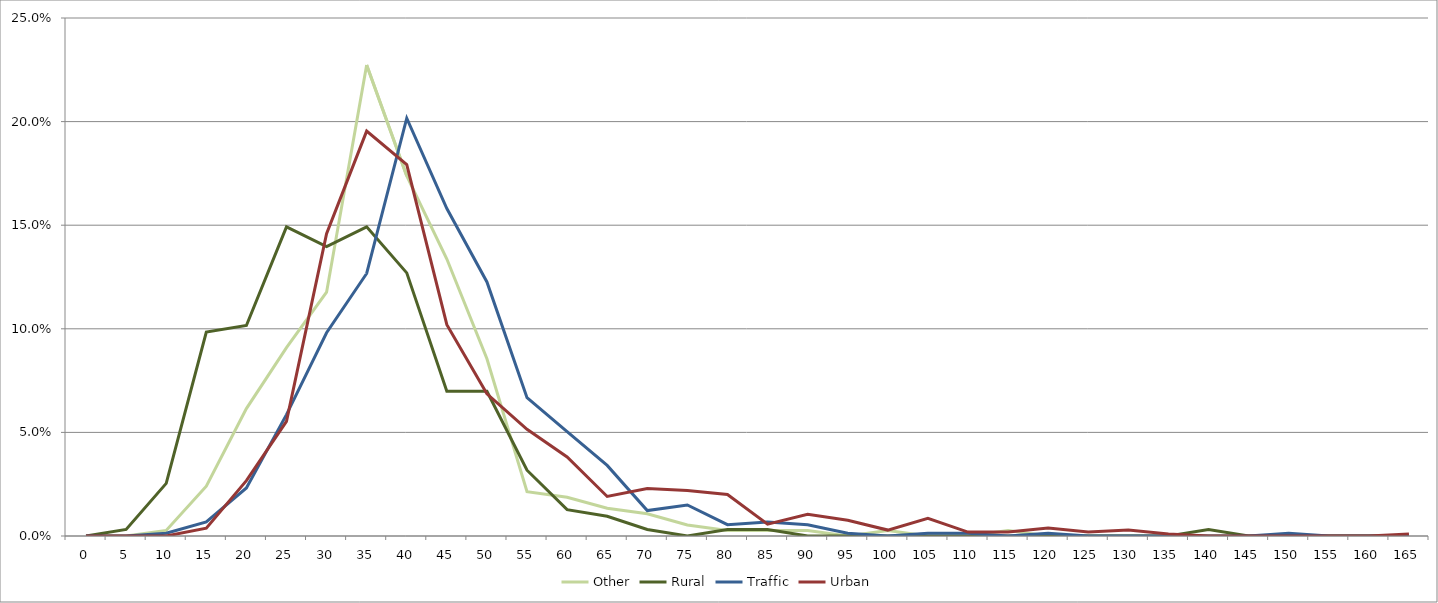
| Category | Other | Rural | Traffic | Urban |
|---|---|---|---|---|
| 0.0 | 0 | 0 | 0 | 0 |
| 5.0 | 0 | 0.003 | 0 | 0 |
| 10.0 | 0.003 | 0.025 | 0.001 | 0 |
| 15.0 | 0.024 | 0.098 | 0.007 | 0.004 |
| 20.0 | 0.061 | 0.102 | 0.023 | 0.027 |
| 25.0 | 0.091 | 0.149 | 0.059 | 0.055 |
| 30.0 | 0.118 | 0.14 | 0.098 | 0.146 |
| 35.0 | 0.227 | 0.149 | 0.127 | 0.195 |
| 40.0 | 0.174 | 0.127 | 0.202 | 0.179 |
| 45.0 | 0.134 | 0.07 | 0.158 | 0.102 |
| 50.0 | 0.086 | 0.07 | 0.123 | 0.069 |
| 55.0 | 0.021 | 0.032 | 0.067 | 0.051 |
| 60.0 | 0.019 | 0.013 | 0.05 | 0.038 |
| 65.0 | 0.013 | 0.01 | 0.034 | 0.019 |
| 70.0 | 0.011 | 0.003 | 0.012 | 0.023 |
| 75.0 | 0.005 | 0 | 0.015 | 0.022 |
| 80.0 | 0.003 | 0.003 | 0.005 | 0.02 |
| 85.0 | 0.003 | 0.003 | 0.007 | 0.006 |
| 90.0 | 0.003 | 0 | 0.005 | 0.01 |
| 95.0 | 0 | 0 | 0.001 | 0.008 |
| 100.0 | 0.003 | 0 | 0 | 0.003 |
| 105.0 | 0 | 0 | 0.001 | 0.009 |
| 110.0 | 0 | 0 | 0.001 | 0.002 |
| 115.0 | 0.003 | 0 | 0 | 0.002 |
| 120.0 | 0 | 0 | 0.001 | 0.004 |
| 125.0 | 0 | 0 | 0 | 0.002 |
| 130.0 | 0 | 0 | 0 | 0.003 |
| 135.0 | 0 | 0 | 0 | 0.001 |
| 140.0 | 0 | 0.003 | 0 | 0 |
| 145.0 | 0 | 0 | 0 | 0 |
| 150.0 | 0 | 0 | 0.001 | 0 |
| 155.0 | 0 | 0 | 0 | 0 |
| 160.0 | 0 | 0 | 0 | 0 |
| 165.0 | 0 | 0 | 0 | 0.001 |